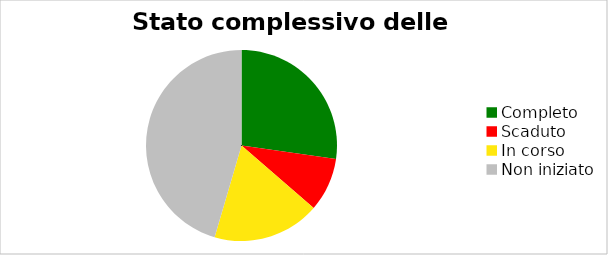
| Category | Series 0 |
|---|---|
| Completo | 0.273 |
| Scaduto | 0.091 |
| In corso | 0.182 |
| Non iniziato | 0.455 |